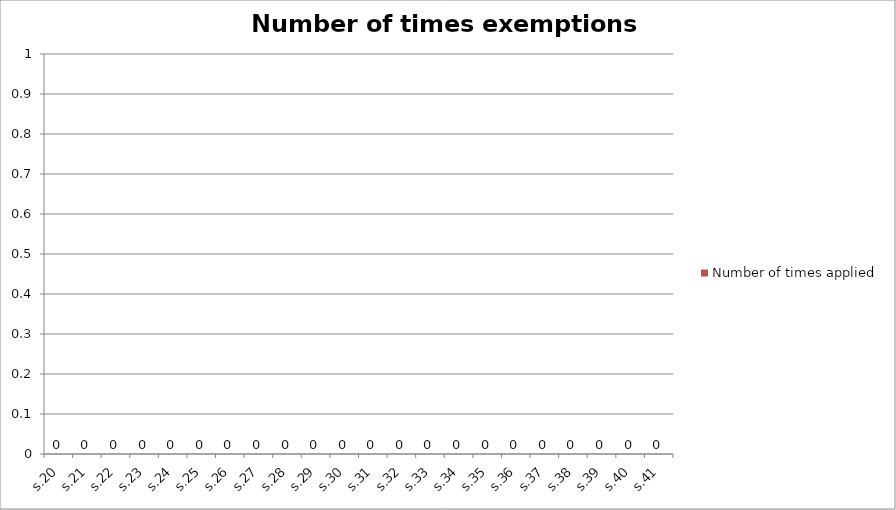
| Category | Number of times applied |
|---|---|
| s.20 | 0 |
| s.21 | 0 |
| s.22 | 0 |
| s.23 | 0 |
| s.24 | 0 |
| s.25 | 0 |
| s.26 | 0 |
| s.27 | 0 |
| s.28 | 0 |
| s.29 | 0 |
| s.30 | 0 |
| s.31 | 0 |
| s.32 | 0 |
| s.33 | 0 |
| s.34 | 0 |
| s.35 | 0 |
| s.36 | 0 |
| s.37 | 0 |
| s.38 | 0 |
| s.39 | 0 |
| s.40 | 0 |
| s.41 | 0 |